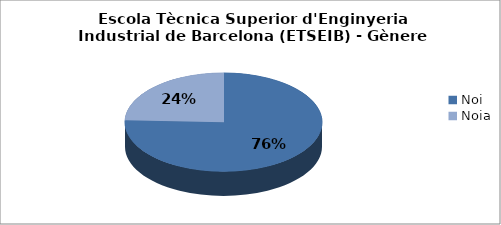
| Category | Escola Tècnica Superior d'Enginyeria Industrial de Barcelona (ETSEIB) - Gènere |
|---|---|
| Noi | 0.756 |
| Noia | 0.244 |